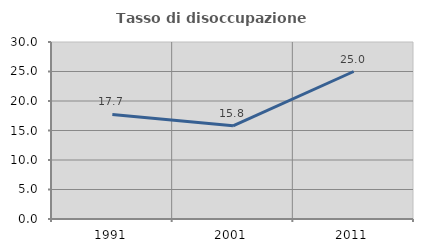
| Category | Tasso di disoccupazione giovanile  |
|---|---|
| 1991.0 | 17.722 |
| 2001.0 | 15.789 |
| 2011.0 | 25 |